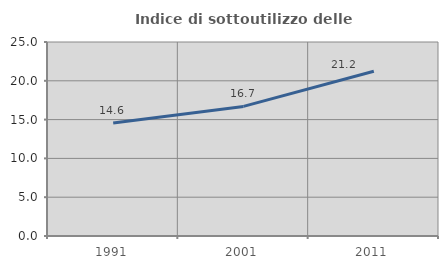
| Category | Indice di sottoutilizzo delle abitazioni  |
|---|---|
| 1991.0 | 14.574 |
| 2001.0 | 16.7 |
| 2011.0 | 21.228 |